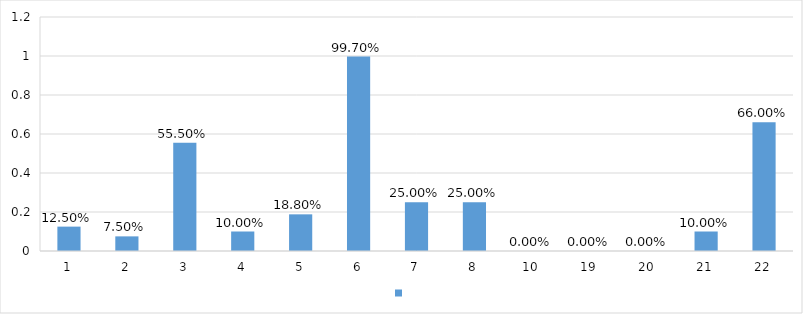
| Category | Series 0 |
|---|---|
| 1 | 0.125 |
| 2 | 0.075 |
| 3 | 0.555 |
| 4 | 0.1 |
| 5 | 0.188 |
| 6 | 0.997 |
| 7 | 0.25 |
| 8 | 0.25 |
| 10 | 0 |
| 19 | 0 |
| 20 | 0 |
| 21 | 0.1 |
| 22 | 0.66 |